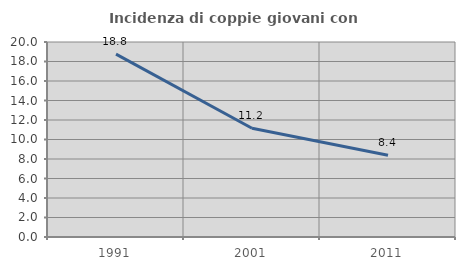
| Category | Incidenza di coppie giovani con figli |
|---|---|
| 1991.0 | 18.75 |
| 2001.0 | 11.152 |
| 2011.0 | 8.389 |